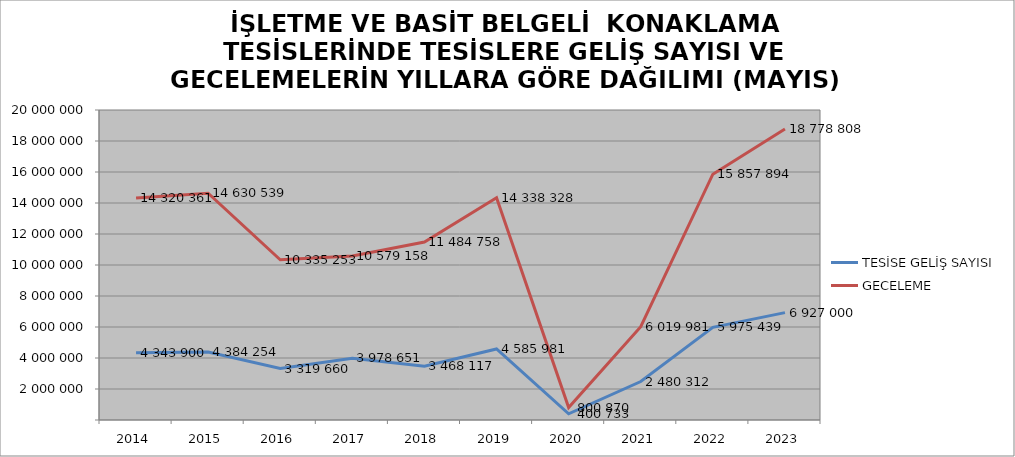
| Category | TESİSE GELİŞ SAYISI | GECELEME |
|---|---|---|
| 2014 | 4343900 | 14320361 |
| 2015 | 4384254 | 14630539 |
| 2016 | 3319660 | 10335253 |
| 2017 | 3978651 | 10579158 |
| 2018 | 3468117 | 11484758 |
| 2019 | 4585981 | 14338328 |
| 2020 | 400733 | 800870 |
| 2021 | 2480312 | 6019981 |
| 2022 | 5975439 | 15857894 |
| 2023 | 6927000 | 18778808 |